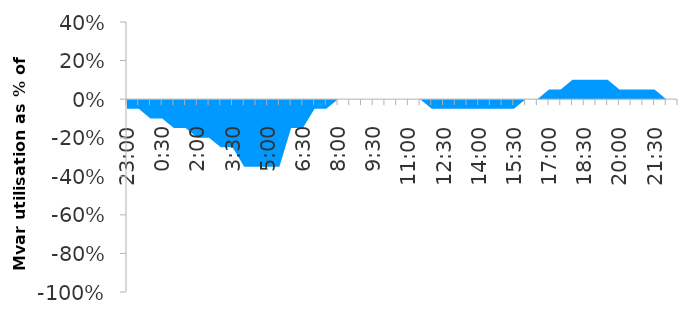
| Category | Series 0 |
|---|---|
| 0.9583333333333334 | -0.05 |
| 0.9791666666666666 | -0.05 |
| 0.0 | -0.1 |
| 0.020833333333333332 | -0.1 |
| 0.041666666666666664 | -0.15 |
| 0.0625 | -0.15 |
| 0.08333333333333333 | -0.2 |
| 0.10416666666666667 | -0.2 |
| 0.125 | -0.25 |
| 0.14583333333333334 | -0.25 |
| 0.16666666666666666 | -0.35 |
| 0.1875 | -0.35 |
| 0.20833333333333334 | -0.35 |
| 0.22916666666666666 | -0.35 |
| 0.25 | -0.15 |
| 0.2708333333333333 | -0.15 |
| 0.2916666666666667 | -0.05 |
| 0.3125 | -0.05 |
| 0.3333333333333333 | 0 |
| 0.3541666666666667 | 0 |
| 0.375 | 0 |
| 0.3958333333333333 | 0 |
| 0.4166666666666667 | 0 |
| 0.4375 | 0 |
| 0.4583333333333333 | 0 |
| 0.4791666666666667 | 0 |
| 0.5 | -0.05 |
| 0.5208333333333334 | -0.05 |
| 0.5416666666666666 | -0.05 |
| 0.5625 | -0.05 |
| 0.5833333333333334 | -0.05 |
| 0.6041666666666666 | -0.05 |
| 0.625 | -0.05 |
| 0.6458333333333334 | -0.05 |
| 0.6666666666666666 | 0 |
| 0.6875 | 0 |
| 0.7083333333333334 | 0.05 |
| 0.7291666666666666 | 0.05 |
| 0.75 | 0.1 |
| 0.7708333333333334 | 0.1 |
| 0.7916666666666666 | 0.1 |
| 0.8125 | 0.1 |
| 0.8333333333333334 | 0.05 |
| 0.8541666666666666 | 0.05 |
| 0.875 | 0.05 |
| 0.8958333333333334 | 0.05 |
| 0.9166666666666666 | 0 |
| 0.9375 | 0 |